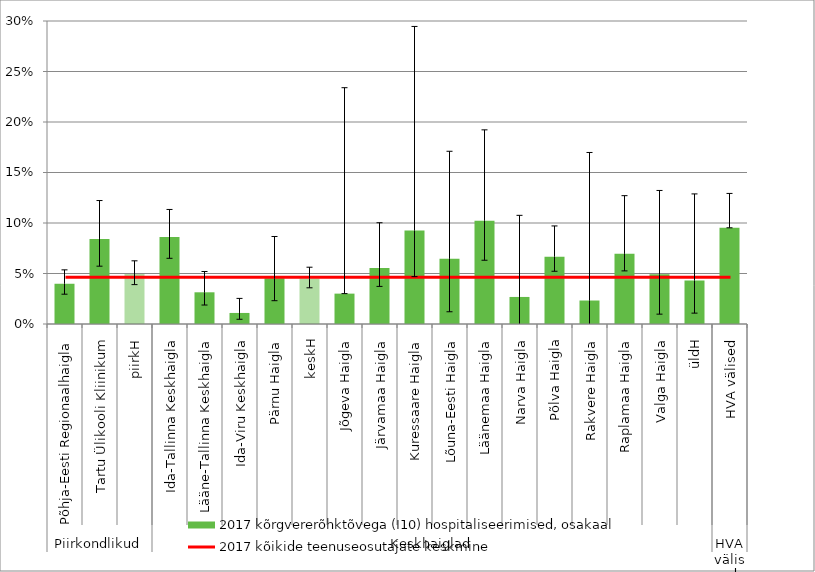
| Category | 2017 kõrgvererõhktõvega (I10) hospitaliseerimised, osakaal |
|---|---|
| 0 | 0.04 |
| 1 | 0.084 |
| 2 | 0.049 |
| 3 | 0.086 |
| 4 | 0.031 |
| 5 | 0.011 |
| 6 | 0.045 |
| 7 | 0.045 |
| 8 | 0.03 |
| 9 | 0.056 |
| 10 | 0.093 |
| 11 | 0.065 |
| 12 | 0.102 |
| 13 | 0.027 |
| 14 | 0.067 |
| 15 | 0.023 |
| 16 | 0.069 |
| 17 | 0.049 |
| 18 | 0.043 |
| 19 | 0.095 |